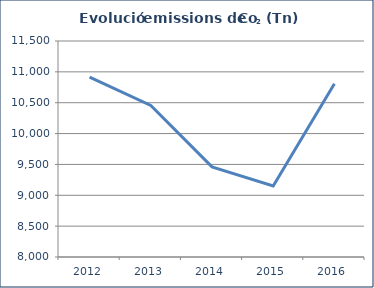
| Category | Co2 (Tn) |
|---|---|
| 2012.0 | 10916.154 |
| 2013.0 | 10456.132 |
| 2014.0 | 9460 |
| 2015.0 | 9152 |
| 2016.0 | 10808 |